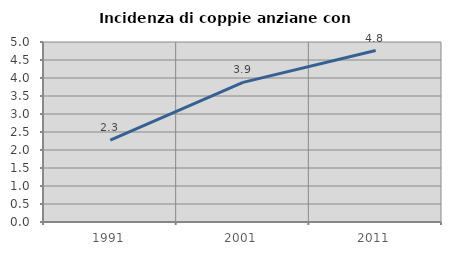
| Category | Incidenza di coppie anziane con figli |
|---|---|
| 1991.0 | 2.273 |
| 2001.0 | 3.878 |
| 2011.0 | 4.762 |